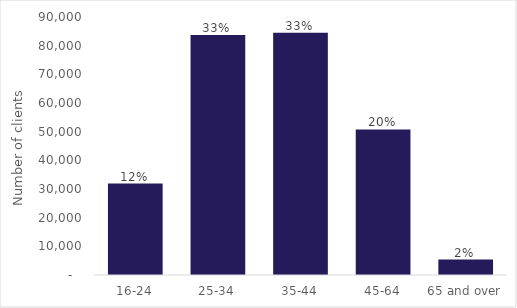
| Category | Series 0 |
|---|---|
| 16-24 | 31910 |
| 25-34 | 83725 |
| 35-44 | 84495 |
| 45-64 | 50770 |
| 65 and over | 5380 |